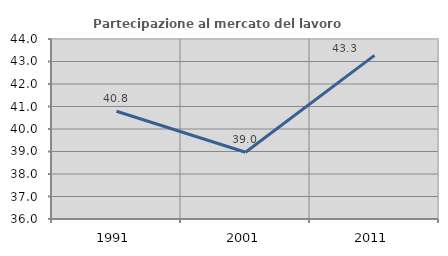
| Category | Partecipazione al mercato del lavoro  femminile |
|---|---|
| 1991.0 | 40.79 |
| 2001.0 | 38.965 |
| 2011.0 | 43.27 |